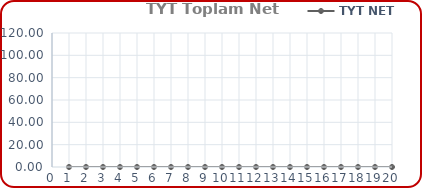
| Category | TYT NET |
|---|---|
| 0 | 0 |
| 1 | 0 |
| 2 | 0 |
| 3 | 0 |
| 4 | 0 |
| 5 | 0 |
| 6 | 0 |
| 7 | 0 |
| 8 | 0 |
| 9 | 0 |
| 10 | 0 |
| 11 | 0 |
| 12 | 0 |
| 13 | 0 |
| 14 | 0 |
| 15 | 0 |
| 16 | 0 |
| 17 | 0 |
| 18 | 0 |
| 19 | 0 |